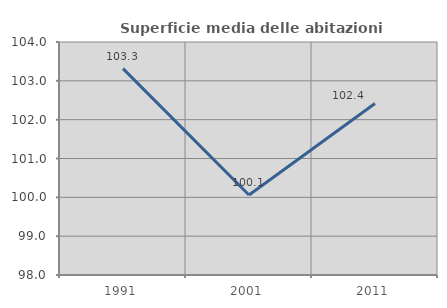
| Category | Superficie media delle abitazioni occupate |
|---|---|
| 1991.0 | 103.314 |
| 2001.0 | 100.06 |
| 2011.0 | 102.417 |